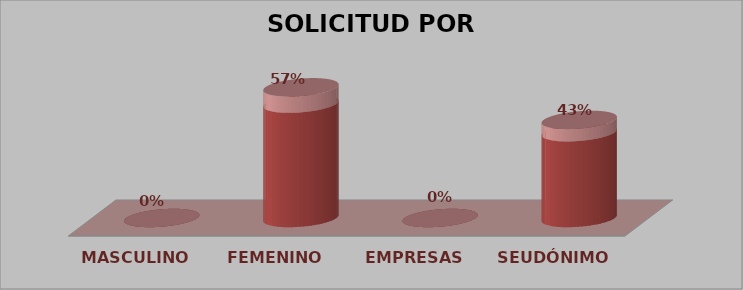
| Category | SOLICITUD POR GÉNERO | Series 1 |
|---|---|---|
| MASCULINO | 0 | 0 |
| FEMENINO | 4 | 0.57 |
| EMPRESAS | 0 | 0 |
| SEUDÓNIMO | 3 | 0.43 |